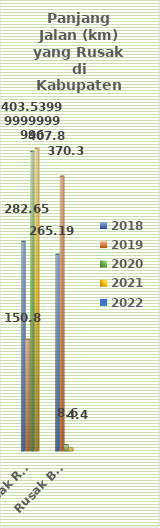
| Category | 2018 | 2019 | 2020 | 2021 | 2022 |
|---|---|---|---|---|---|
| Rusak Ringan | 282.655 | 150.82 | 403.54 | 407.81 |  |
| Rusak Berat | 265.192 | 370.39 | 8.6 | 4.4 |  |